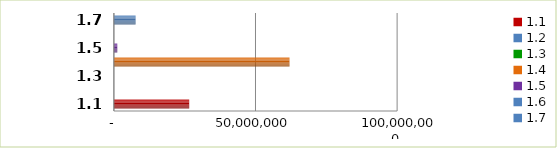
| Category | Series 0 |
|---|---|
| 1.1 | 26588113 |
| 1.2 | 0 |
| 1.3 | 0 |
| 1.4 | 62000000 |
| 1.5 | 1200000 |
| 1.6 | 0 |
| 1.7 | 7660590 |